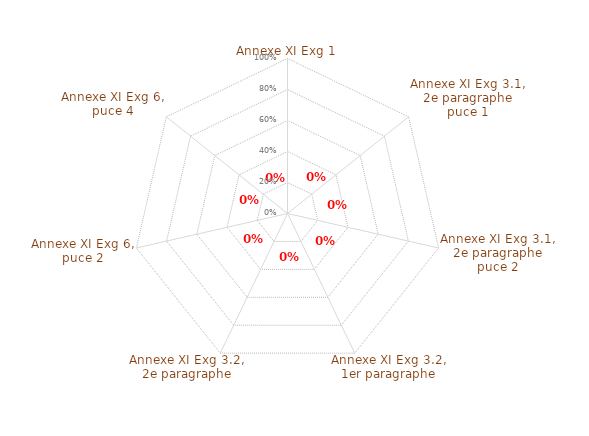
| Category | annexe XI |
|---|---|
| Annexe XI Exg 1 | 0 |
| Annexe XI Exg 3.1, 2e paragraphe puce 1 | 0 |
| Annexe XI Exg 3.1, 2e paragraphe puce 2 | 0 |
| Annexe XI Exg 3.2, 1er paragraphe | 0 |
| Annexe XI Exg 3.2, 2e paragraphe | 0 |
| Annexe XI Exg 6, puce 2 | 0 |
| Annexe XI Exg 6, puce 4 | 0 |